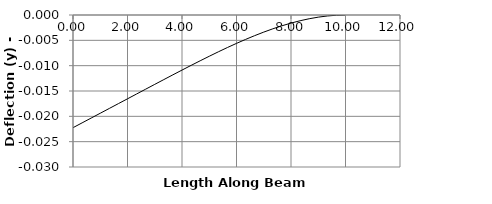
| Category | y |
|---|---|
| 0.0 | -0.022 |
| 0.3333333333333333 | -0.021 |
| 0.6666666666666666 | -0.02 |
| 1.0 | -0.019 |
| 1.3333333333333333 | -0.018 |
| 1.6666666666666665 | -0.017 |
| 2.0 | -0.017 |
| 2.0 | -0.017 |
| 2.333333333333333 | -0.016 |
| 2.6666666666666665 | -0.015 |
| 3.0 | -0.014 |
| 3.333333333333333 | -0.013 |
| 3.6666666666666665 | -0.012 |
| 4.0 | -0.011 |
| 4.333333333333333 | -0.01 |
| 4.666666666666666 | -0.009 |
| 5.0 | -0.008 |
| 5.333333333333333 | -0.007 |
| 5.666666666666666 | -0.006 |
| 6.0 | -0.006 |
| 6.333333333333333 | -0.005 |
| 6.666666666666666 | -0.004 |
| 7.0 | -0.003 |
| 7.333333333333333 | -0.003 |
| 7.666666666666666 | -0.002 |
| 8.0 | -0.002 |
| 8.0 | -0.002 |
| 8.333333333333332 | -0.001 |
| 8.666666666666666 | -0.001 |
| 9.0 | 0 |
| 9.333333333333332 | 0 |
| 9.666666666666666 | 0 |
| 10.0 | 0 |